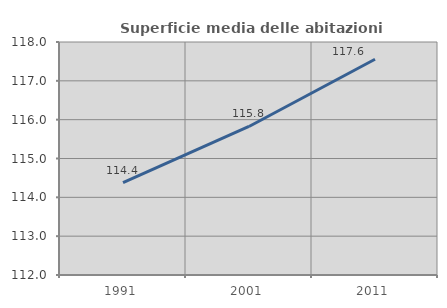
| Category | Superficie media delle abitazioni occupate |
|---|---|
| 1991.0 | 114.379 |
| 2001.0 | 115.824 |
| 2011.0 | 117.556 |